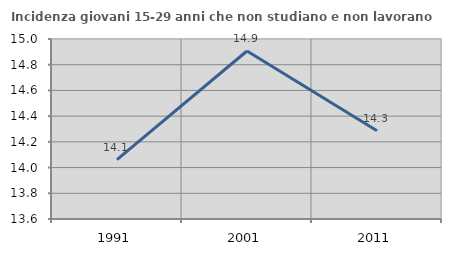
| Category | Incidenza giovani 15-29 anni che non studiano e non lavorano  |
|---|---|
| 1991.0 | 14.062 |
| 2001.0 | 14.907 |
| 2011.0 | 14.286 |